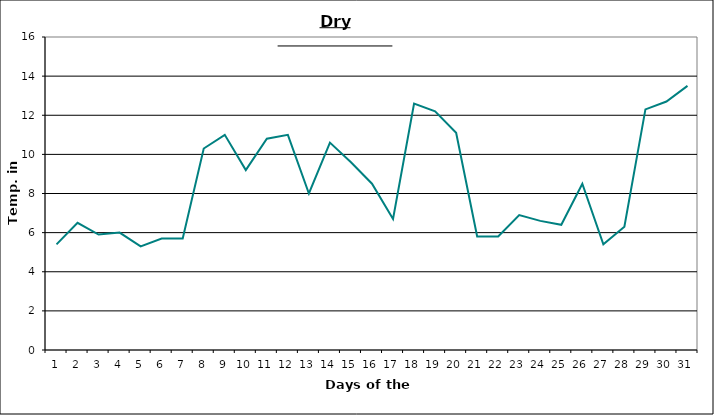
| Category | Series 0 |
|---|---|
| 0 | 5.4 |
| 1 | 6.5 |
| 2 | 5.9 |
| 3 | 6 |
| 4 | 5.3 |
| 5 | 5.7 |
| 6 | 5.7 |
| 7 | 10.3 |
| 8 | 11 |
| 9 | 9.2 |
| 10 | 10.8 |
| 11 | 11 |
| 12 | 8 |
| 13 | 10.6 |
| 14 | 9.6 |
| 15 | 8.5 |
| 16 | 6.7 |
| 17 | 12.6 |
| 18 | 12.2 |
| 19 | 11.1 |
| 20 | 5.8 |
| 21 | 5.8 |
| 22 | 6.9 |
| 23 | 6.6 |
| 24 | 6.4 |
| 25 | 8.5 |
| 26 | 5.4 |
| 27 | 6.3 |
| 28 | 12.3 |
| 29 | 12.7 |
| 30 | 13.5 |